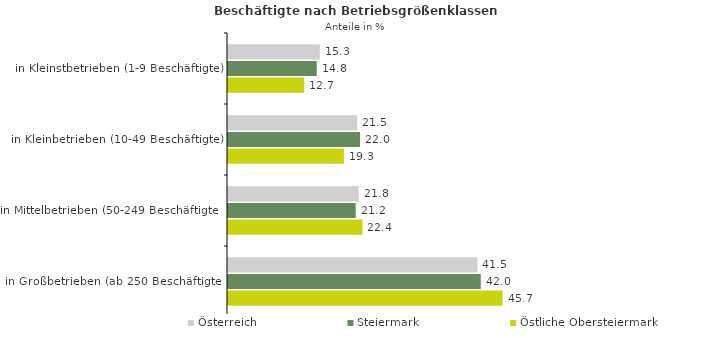
| Category | Österreich | Steiermark | Östliche Obersteiermark |
|---|---|---|---|
| in Kleinstbetrieben (1-9 Beschäftigte) | 15.273 | 14.768 | 12.686 |
| in Kleinbetrieben (10-49 Beschäftigte) | 21.487 | 21.955 | 19.282 |
| in Mittelbetrieben (50-249 Beschäftigte) | 21.75 | 21.237 | 22.36 |
| in Großbetrieben (ab 250 Beschäftigte) | 41.489 | 42.04 | 45.672 |